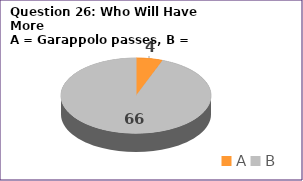
| Category | Series 0 |
|---|---|
| A | 4 |
| B | 66 |